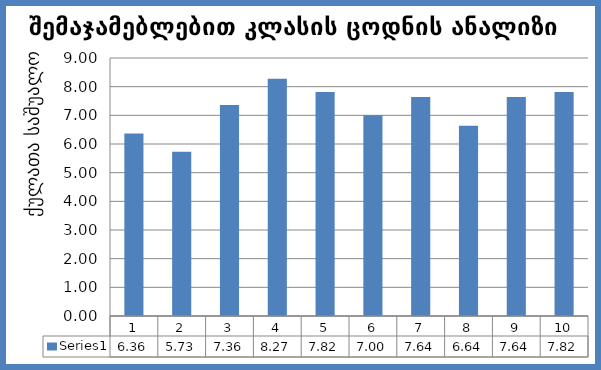
| Category | Series 0 |
|---|---|
| 0 | 6.364 |
| 1 | 5.727 |
| 2 | 7.364 |
| 3 | 8.273 |
| 4 | 7.818 |
| 5 | 7 |
| 6 | 7.636 |
| 7 | 6.636 |
| 8 | 7.636 |
| 9 | 7.818 |